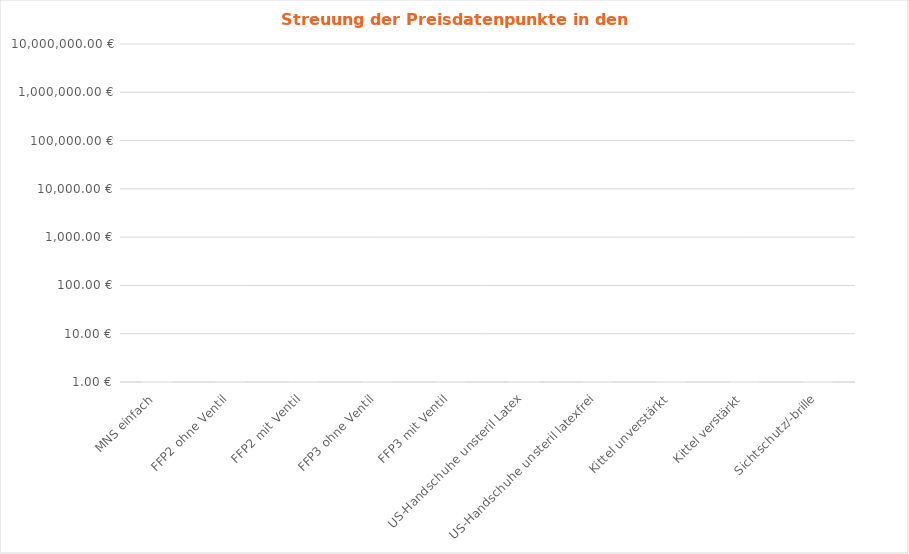
| Category | Series 0 | Series 1 | Series 2 | Series 3 | Series 4 |
|---|---|---|---|---|---|
| MNS einfach | 0.01 | 0.032 | 0.018 | 0.025 | 0.593 |
| FFP2 ohne Ventil | 0.575 | 0.921 | 0.154 | 1.325 | 2.737 |
| FFP2 mit Ventil | 0.64 | 1.46 | 0 | 0.167 | 2.732 |
| FFP3 ohne Ventil | 0.83 | 0.198 | 2.172 | 0.062 | 3.688 |
| FFP3 mit Ventil | 0.94 | 1.321 | 1.939 | 0.4 | 0.874 |
| US-Handschuhe unsteril Latex | 0.022 | 0 | 0 | 0.022 | 0.017 |
| US-Handschuhe unsteril latexfrei | 0.022 | 0.003 | 0 | 0.007 | 0.005 |
| Kittel unverstärkt | 0.19 | 0.13 | 0.061 | 0.369 | 0.059 |
| Kittel verstärkt | 0.32 | 0 | 0.033 | 0.14 | 0.946 |
| Sichtschutz/-brille | 0.71 | 0.53 | 0.085 | 0.975 | 3.12 |